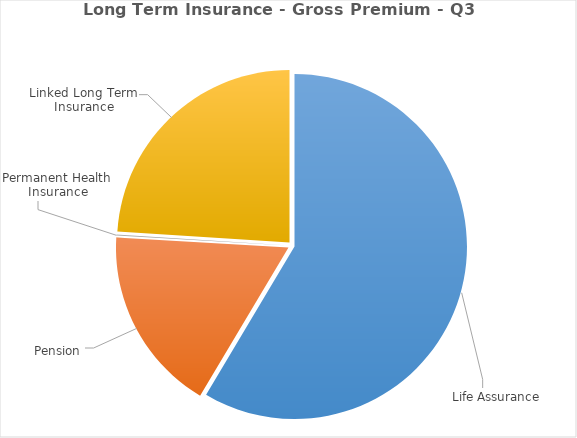
| Category | Series 0 |
|---|---|
| Life Assurance | 1313265058 |
| Pension | 389082976 |
| Permanent Health Insurance | 2537439 |
| Linked Long Term Insurance | 537615416 |